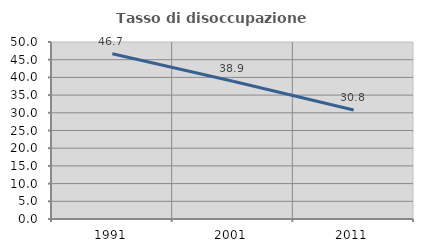
| Category | Tasso di disoccupazione giovanile  |
|---|---|
| 1991.0 | 46.667 |
| 2001.0 | 38.889 |
| 2011.0 | 30.769 |